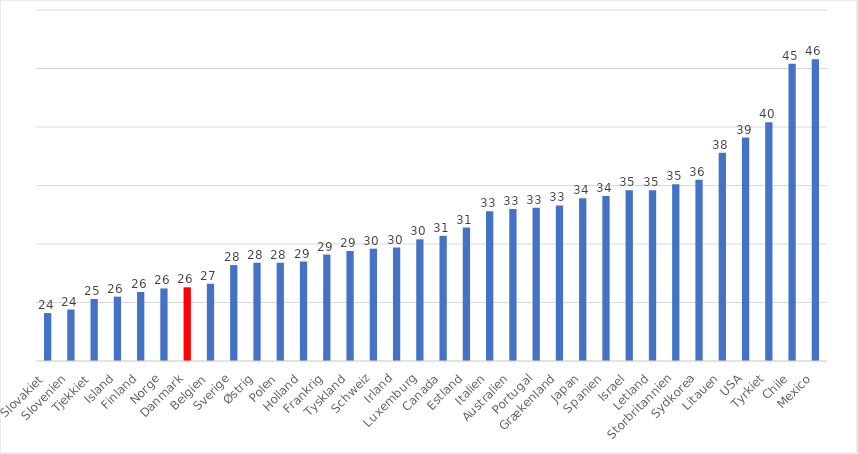
| Category | Series 0 |
|---|---|
| Slovakiet | 24.1 |
| Slovenien | 24.4 |
| Tjekkiet | 25.3 |
| Island | 25.5 |
| Finland | 25.9 |
| Norge | 26.2 |
| Danmark | 26.3 |
| Belgien | 26.6 |
| Sverige | 28.2 |
| Østrig | 28.4 |
| Polen | 28.4 |
| Holland | 28.5 |
| Frankrig | 29.1 |
| Tyskland | 29.4 |
| Schweiz | 29.6 |
| Irland | 29.7 |
| Luxemburg | 30.4 |
| Canada | 30.7 |
| Estland | 31.4 |
| Italien | 32.8 |
| Australien | 33 |
| Portugal | 33.1 |
| Grækenland | 33.3 |
| Japan | 33.9 |
| Spanien | 34.1 |
| Israel | 34.6 |
| Letland | 34.6 |
| Storbritannien | 35.1 |
| Sydkorea | 35.5 |
| Litauen | 37.8 |
| USA | 39.1 |
| Tyrkiet | 40.4 |
| Chile | 45.4 |
| Mexico | 45.8 |